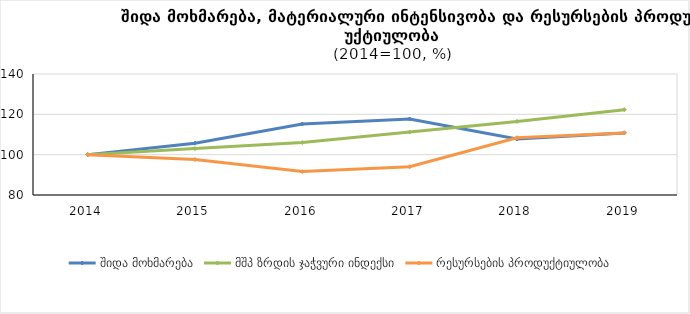
| Category | შიდა მოხმარება | მშპ ზრდის ჯაჭვური ინდექსი | რესურსების პროდუქტიულობა |
|---|---|---|---|
| 2014.0 | 100 | 100 | 100 |
| 2015.0 | 105.7 | 103 | 97.6 |
| 2016.0 | 115.2 | 106 | 91.6 |
| 2017.0 | 117.7 | 111.2 | 94 |
| 2018.0 | 107.8 | 116.5 | 108.4 |
| 2019.0 | 110.8 | 122.3 | 110.8 |